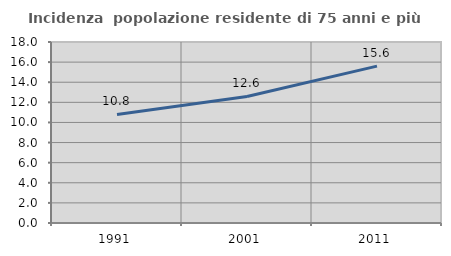
| Category | Incidenza  popolazione residente di 75 anni e più |
|---|---|
| 1991.0 | 10.801 |
| 2001.0 | 12.582 |
| 2011.0 | 15.601 |